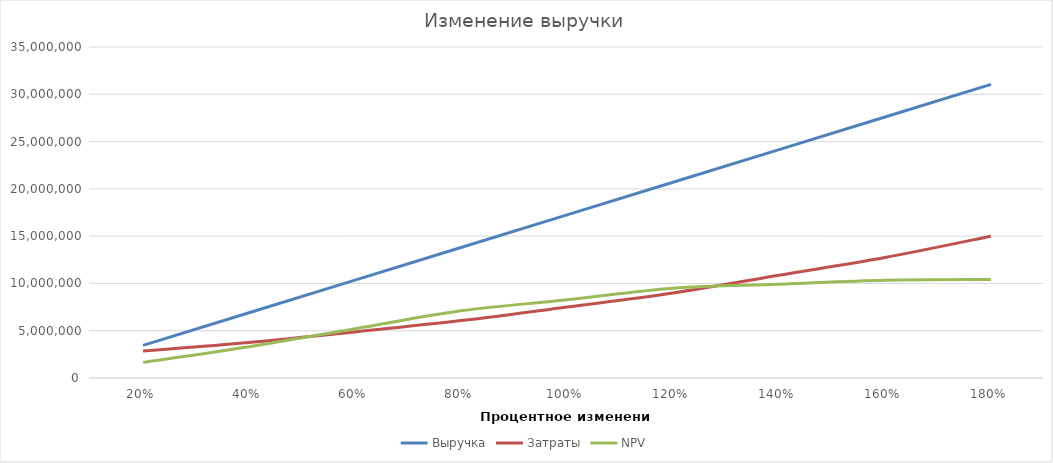
| Category | Выручка | Затраты | NPV |
|---|---|---|---|
| 0.2 | 3450000 | 2849430 | 1652520.71 |
| 0.4 | 6900000 | 3749250 | 3305041.42 |
| 0.6 | 10350000 | 4874025 | 5205440.237 |
| 0.8 | 13800000 | 6073785 | 7105839.053 |
| 1.0 | 17250000 | 7498500 | 8262603.55 |
| 1.2 | 20700000 | 8998200 | 9501994.083 |
| 1.4 | 24150000 | 10872825 | 9915124.26 |
| 1.6 | 27600000 | 12747450 | 10328254.438 |
| 1.8 | 31050000 | 14997000 | 10410880.473 |